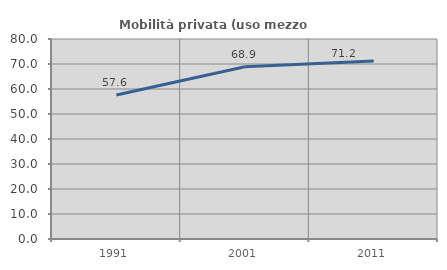
| Category | Mobilità privata (uso mezzo privato) |
|---|---|
| 1991.0 | 57.579 |
| 2001.0 | 68.895 |
| 2011.0 | 71.21 |